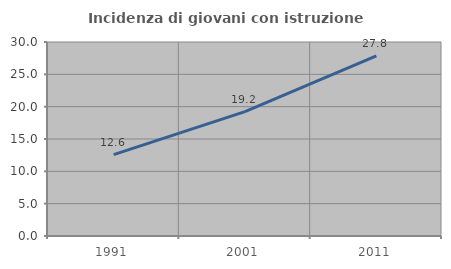
| Category | Incidenza di giovani con istruzione universitaria |
|---|---|
| 1991.0 | 12.58 |
| 2001.0 | 19.243 |
| 2011.0 | 27.849 |